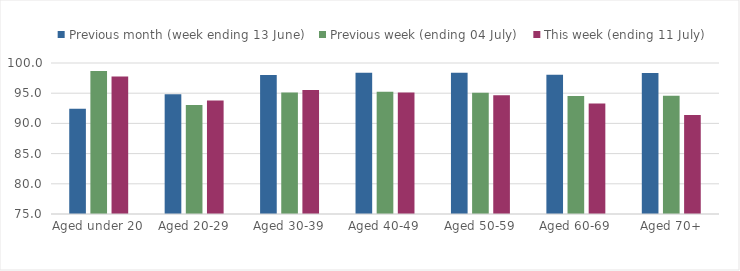
| Category | Previous month (week ending 13 June) | Previous week (ending 04 July) | This week (ending 11 July) |
|---|---|---|---|
| Aged under 20 | 92.446 | 98.684 | 97.751 |
| Aged 20-29 | 94.82 | 93.026 | 93.777 |
| Aged 30-39 | 98.019 | 95.122 | 95.517 |
| Aged 40-49 | 98.406 | 95.239 | 95.107 |
| Aged 50-59 | 98.381 | 95.089 | 94.677 |
| Aged 60-69 | 98.067 | 94.535 | 93.302 |
| Aged 70+ | 98.325 | 94.565 | 91.392 |